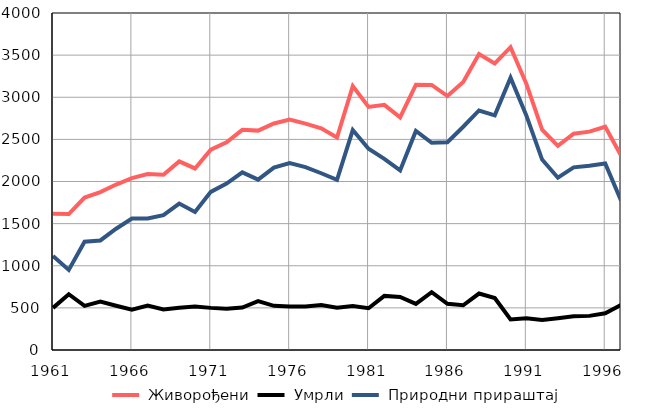
| Category |  Живорођени |  Умрли |  Природни прираштај |
|---|---|---|---|
| 1961.0 | 1616 | 500 | 1116 |
| 1962.0 | 1613 | 662 | 951 |
| 1963.0 | 1810 | 524 | 1286 |
| 1964.0 | 1875 | 575 | 1300 |
| 1965.0 | 1964 | 525 | 1439 |
| 1966.0 | 2040 | 479 | 1561 |
| 1967.0 | 2088 | 527 | 1561 |
| 1968.0 | 2080 | 480 | 1600 |
| 1969.0 | 2239 | 501 | 1738 |
| 1970.0 | 2155 | 516 | 1639 |
| 1971.0 | 2377 | 500 | 1877 |
| 1972.0 | 2464 | 489 | 1975 |
| 1973.0 | 2613 | 504 | 2109 |
| 1974.0 | 2604 | 581 | 2023 |
| 1975.0 | 2689 | 524 | 2165 |
| 1976.0 | 2736 | 517 | 2219 |
| 1977.0 | 2687 | 517 | 2170 |
| 1978.0 | 2632 | 534 | 2098 |
| 1979.0 | 2522 | 501 | 2021 |
| 1980.0 | 3133 | 522 | 2611 |
| 1981.0 | 2885 | 496 | 2389 |
| 1982.0 | 2910 | 642 | 2268 |
| 1983.0 | 2761 | 630 | 2131 |
| 1984.0 | 3147 | 547 | 2600 |
| 1985.0 | 3146 | 686 | 2460 |
| 1986.0 | 3014 | 548 | 2466 |
| 1987.0 | 3181 | 531 | 2650 |
| 1988.0 | 3513 | 670 | 2843 |
| 1989.0 | 3401 | 616 | 2785 |
| 1990.0 | 3594 | 362 | 3232 |
| 1991.0 | 3161 | 376 | 2785 |
| 1992.0 | 2616 | 356 | 2260 |
| 1993.0 | 2423 | 378 | 2045 |
| 1994.0 | 2568 | 400 | 2168 |
| 1995.0 | 2592 | 405 | 2187 |
| 1996.0 | 2650 | 436 | 2214 |
| 1997.0 | 2309 | 534 | 1775 |